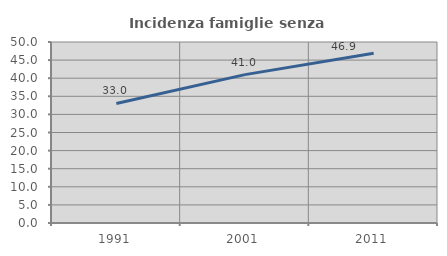
| Category | Incidenza famiglie senza nuclei |
|---|---|
| 1991.0 | 33.023 |
| 2001.0 | 40.991 |
| 2011.0 | 46.907 |